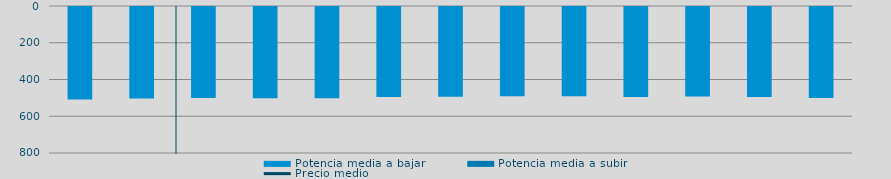
| Category | Potencia media a bajar | Potencia media a subir |
|---|---|---|
| 0 | 503.264 |  |
| 1 | 498.488 |  |
| 2 | 495.172 |  |
| 3 | 496.264 |  |
| 4 | 496.176 |  |
| 5 | 490.249 |  |
| 6 | 488.138 |  |
| 7 | 485.047 |  |
| 8 | 485.731 |  |
| 9 | 489.157 |  |
| 10 | 487.01 |  |
| 11 | 490.333 |  |
| 12 | 495.342 |  |